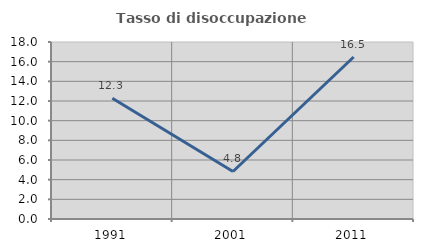
| Category | Tasso di disoccupazione giovanile  |
|---|---|
| 1991.0 | 12.281 |
| 2001.0 | 4.833 |
| 2011.0 | 16.477 |